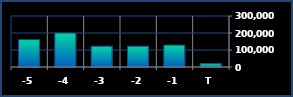
| Category | Series 0 |
|---|---|
| T | 21104 |
| -1 | 128839 |
| -2 | 122432 |
| -3 | 122436 |
| -4 | 199783 |
| -5 | 161036 |